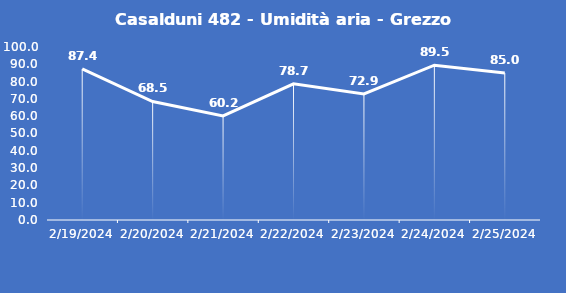
| Category | Casalduni 482 - Umidità aria - Grezzo (%) |
|---|---|
| 2/19/24 | 87.4 |
| 2/20/24 | 68.5 |
| 2/21/24 | 60.2 |
| 2/22/24 | 78.7 |
| 2/23/24 | 72.9 |
| 2/24/24 | 89.5 |
| 2/25/24 | 85 |